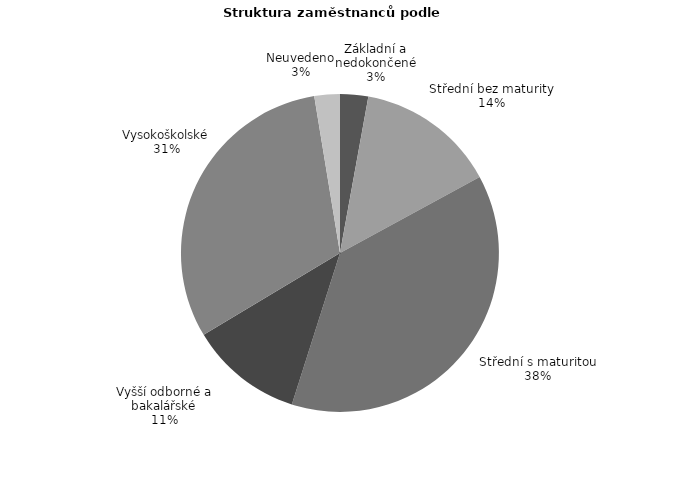
| Category | Series 0 |
|---|---|
| Základní a nedokončené | 18.357 |
| Střední bez maturity | 91.17 |
| Střední s maturitou | 242.927 |
| Vyšší odborné a bakalářské | 73.809 |
| Vysokoškolské | 199.088 |
| Neuvedeno | 16.658 |